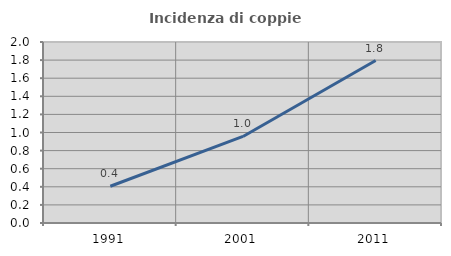
| Category | Incidenza di coppie miste |
|---|---|
| 1991.0 | 0.406 |
| 2001.0 | 0.956 |
| 2011.0 | 1.796 |